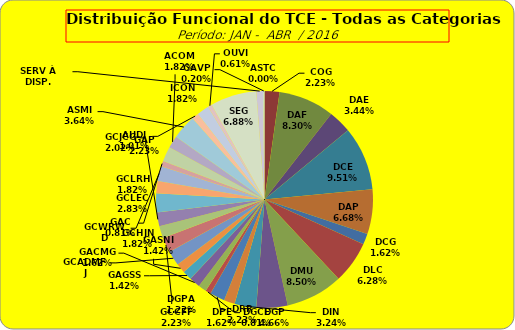
| Category | ASTC |
|---|---|
| ASTC | 0 |
| COG | 11 |
| DAF | 41 |
| DAE | 17 |
| DCE | 47 |
| DAP | 33 |
| DCG | 8 |
| DLC | 31 |
| DMU | 42 |
| DGP | 23 |
| DIN | 16 |
| DPE | 8 |
| DRR | 11 |
| DGCE | 4 |
| DGPA | 6 |
| GACMG | 8 |
| GAGSS | 7 |
| GASNI | 7 |
| GCADMFJ | 11 |
| GCCFF | 11 |
| GCHJN | 9 |
| GCJCG | 10 |
| GCLEC | 14 |
| GCLRH | 9 |
| GCWRWD | 11 |
| GAC | 4 |
| GAP | 11 |
| ACOM | 9 |
| ASMI | 18 |
| AUDI | 5 |
| ICON | 9 |
| OUVI | 3 |
| SEG | 34 |
| SERV À DISP. | 5 |
| GAVP | 1 |